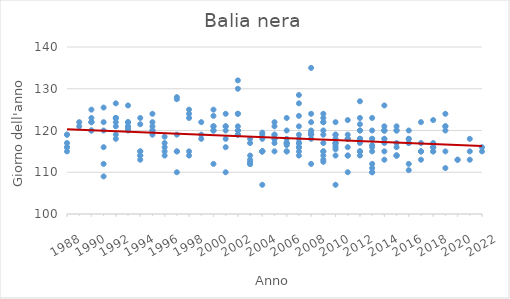
| Category | Series 0 |
|---|---|
| 1988.0 | 116 |
| 1988.0 | 115 |
| 1988.0 | 119 |
| 1988.0 | 116 |
| 1988.0 | 119 |
| 1988.0 | 117 |
| 1989.0 | 122 |
| 1989.0 | 121 |
| 1990.0 | 120 |
| 1990.0 | 123 |
| 1990.0 | 122 |
| 1990.0 | 122 |
| 1990.0 | 125 |
| 1990.0 | 122 |
| 1990.0 | 120 |
| 1991.0 | 112 |
| 1991.0 | 120 |
| 1991.0 | 116 |
| 1991.0 | 125.5 |
| 1991.0 | 109 |
| 1991.0 | 122 |
| 1992.0 | 118 |
| 1992.0 | 123 |
| 1992.0 | 122 |
| 1992.0 | 121 |
| 1992.0 | 126.5 |
| 1992.0 | 123 |
| 1992.0 | 123 |
| 1992.0 | 119 |
| 1993.0 | 121 |
| 1993.0 | 126 |
| 1993.0 | 120.5 |
| 1993.0 | 122 |
| 1993.0 | 121 |
| 1993.0 | 122 |
| 1993.0 | 120 |
| 1994.0 | 114 |
| 1994.0 | 123 |
| 1994.0 | 115 |
| 1994.0 | 113 |
| 1994.0 | 115 |
| 1994.0 | 121.5 |
| 1994.0 | 114 |
| 1995.0 | 119 |
| 1995.0 | 124 |
| 1995.0 | 120 |
| 1995.0 | 121 |
| 1995.0 | 122 |
| 1995.0 | 120 |
| 1996.0 | 114 |
| 1996.0 | 118.5 |
| 1996.0 | 116 |
| 1996.0 | 117 |
| 1996.0 | 115 |
| 1997.0 | 115 |
| 1997.0 | 110 |
| 1997.0 | 128 |
| 1997.0 | 127.5 |
| 1997.0 | 119 |
| 1997.0 | 115 |
| 1998.0 | 125 |
| 1998.0 | 124 |
| 1998.0 | 115 |
| 1998.0 | 114 |
| 1998.0 | 123 |
| 1999.0 | 118 |
| 1999.0 | 122 |
| 1999.0 | 119 |
| 2000.0 | 123.5 |
| 2000.0 | 125 |
| 2000.0 | 121 |
| 2000.0 | 120 |
| 2000.0 | 120 |
| 2000.0 | 112 |
| 2000.0 | 121 |
| 2001.0 | 121 |
| 2001.0 | 116 |
| 2001.0 | 120 |
| 2001.0 | 124 |
| 2001.0 | 121 |
| 2001.0 | 110 |
| 2001.0 | 118 |
| 2002.0 | 120 |
| 2002.0 | 132 |
| 2002.0 | 119 |
| 2002.0 | 124 |
| 2002.0 | 121 |
| 2002.0 | 119 |
| 2002.0 | 120 |
| 2002.0 | 120 |
| 2002.0 | 124 |
| 2002.0 | 130 |
| 2003.0 | 113 |
| 2003.0 | 118 |
| 2003.0 | 112 |
| 2003.0 | 112.5 |
| 2003.0 | 112 |
| 2003.0 | 114 |
| 2003.0 | 112 |
| 2003.0 | 117 |
| 2004.0 | 115 |
| 2004.0 | 115 |
| 2004.0 | 119 |
| 2004.0 | 119.5 |
| 2004.0 | 115 |
| 2004.0 | 115 |
| 2004.0 | 107 |
| 2004.0 | 118 |
| 2005.0 | 118 |
| 2005.0 | 117 |
| 2005.0 | 121 |
| 2005.0 | 115 |
| 2005.0 | 122 |
| 2005.0 | 118 |
| 2005.0 | 119 |
| 2005.0 | 119 |
| 2006.0 | 117 |
| 2006.0 | 115 |
| 2006.0 | 115 |
| 2006.0 | 120 |
| 2006.0 | 118 |
| 2006.0 | 123 |
| 2006.0 | 117 |
| 2006.0 | 117 |
| 2006.0 | 116.5 |
| 2007.0 | 121 |
| 2007.0 | 115 |
| 2007.0 | 126.5 |
| 2007.0 | 116 |
| 2007.0 | 117 |
| 2007.0 | 117 |
| 2007.0 | 119 |
| 2007.0 | 123.5 |
| 2007.0 | 116 |
| 2007.0 | 118 |
| 2007.0 | 114 |
| 2007.0 | 128.5 |
| 2008.0 | 119 |
| 2008.0 | 120 |
| 2008.0 | 119.5 |
| 2008.0 | 122 |
| 2008.0 | 112 |
| 2008.0 | 119 |
| 2008.0 | 124 |
| 2008.0 | 135 |
| 2008.0 | 118 |
| 2008.0 | 119 |
| 2008.0 | 119 |
| 2009.0 | 114 |
| 2009.0 | 115 |
| 2009.0 | 122 |
| 2009.0 | 120 |
| 2009.0 | 123 |
| 2009.0 | 113 |
| 2009.0 | 117 |
| 2009.0 | 119 |
| 2009.0 | 115 |
| 2009.0 | 124 |
| 2009.0 | 112.5 |
| 2009.0 | 122 |
| 2010.0 | 115.5 |
| 2010.0 | 117 |
| 2010.0 | 118 |
| 2010.0 | 119 |
| 2010.0 | 117 |
| 2010.0 | 117 |
| 2010.0 | 114 |
| 2010.0 | 122 |
| 2010.0 | 119 |
| 2010.0 | 116.5 |
| 2010.0 | 107 |
| 2010.0 | 116 |
| 2011.0 | 110 |
| 2011.0 | 118 |
| 2011.0 | 114 |
| 2011.0 | 114 |
| 2011.0 | 118 |
| 2011.0 | 122.5 |
| 2011.0 | 116 |
| 2011.0 | 119 |
| 2011.0 | 118 |
| 2012.0 | 114 |
| 2012.0 | 118 |
| 2012.0 | 118 |
| 2012.0 | 120 |
| 2012.0 | 123 |
| 2012.0 | 118 |
| 2012.0 | 120 |
| 2012.0 | 121.5 |
| 2012.0 | 127 |
| 2012.0 | 115 |
| 2012.0 | 115 |
| 2012.0 | 117 |
| 2012.0 | 118 |
| 2012.0 | 115 |
| 2013.0 | 112 |
| 2013.0 | 110 |
| 2013.0 | 120 |
| 2013.0 | 123 |
| 2013.0 | 111 |
| 2013.0 | 118 |
| 2013.0 | 118 |
| 2013.0 | 116 |
| 2013.0 | 110 |
| 2013.0 | 115 |
| 2013.0 | 116.5 |
| 2014.0 | 121 |
| 2014.0 | 120 |
| 2014.0 | 115 |
| 2014.0 | 117 |
| 2014.0 | 118 |
| 2014.0 | 126 |
| 2014.0 | 118 |
| 2014.0 | 120 |
| 2014.0 | 113 |
| 2014.0 | 120 |
| 2015.0 | 114 |
| 2015.0 | 114 |
| 2015.0 | 117 |
| 2015.0 | 120 |
| 2015.0 | 114 |
| 2015.0 | 121 |
| 2015.0 | 120 |
| 2015.0 | 116 |
| 2016.0 | 120 |
| 2016.0 | 118 |
| 2016.0 | 117 |
| 2016.0 | 118 |
| 2016.0 | 112 |
| 2016.0 | 110.5 |
| 2016.0 | 117 |
| 2017.0 | 122 |
| 2017.0 | 115 |
| 2017.0 | 117 |
| 2017.0 | 115 |
| 2017.0 | 115 |
| 2017.0 | 113 |
| 2018.0 | 115 |
| 2018.0 | 116 |
| 2018.0 | 122.5 |
| 2018.0 | 116 |
| 2018.0 | 117 |
| 2018.0 | 116 |
| 2018.0 | 115 |
| 2019.0 | 121 |
| 2019.0 | 115 |
| 2019.0 | 121 |
| 2019.0 | 124 |
| 2019.0 | 111 |
| 2019.0 | 120 |
| 2020.0 | 113 |
| 2020.0 | 113 |
| 2021.0 | 113 |
| 2021.0 | 115 |
| 2021.0 | 118 |
| 2022.0 | 115 |
| 2022.0 | 116 |